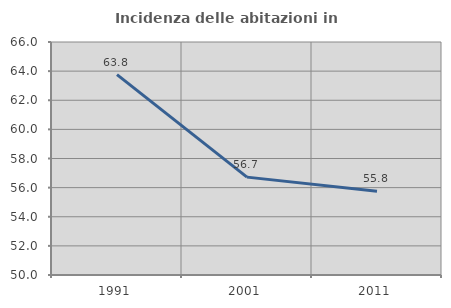
| Category | Incidenza delle abitazioni in proprietà  |
|---|---|
| 1991.0 | 63.763 |
| 2001.0 | 56.721 |
| 2011.0 | 55.758 |